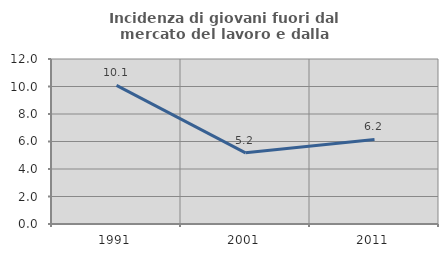
| Category | Incidenza di giovani fuori dal mercato del lavoro e dalla formazione  |
|---|---|
| 1991.0 | 10.082 |
| 2001.0 | 5.176 |
| 2011.0 | 6.154 |